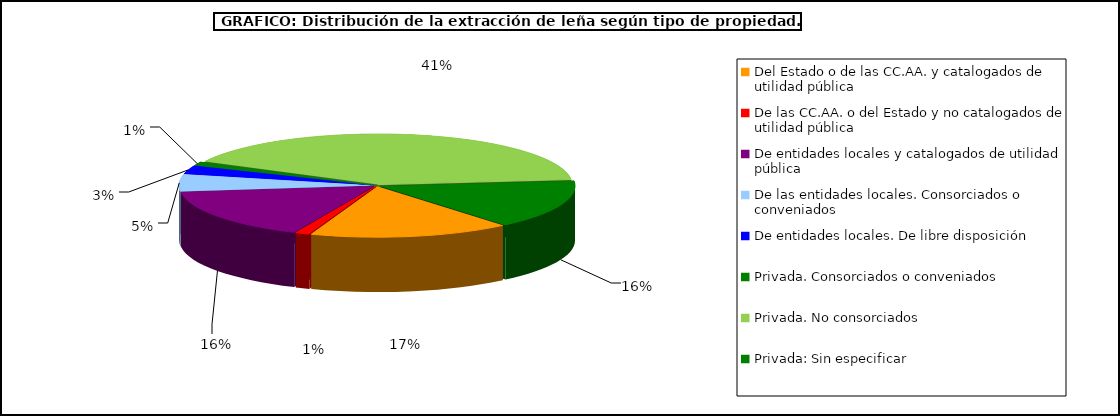
| Category | Series 0 |
|---|---|
| Del Estado o de las CC.AA. y catalogados de utilidad pública | 285976.557 |
| De las CC.AA. o del Estado y no catalogados de utilidad pública | 20364.729 |
| De entidades locales y catalogados de utilidad pública | 280786.675 |
| De las entidades locales. Consorciados o conveniados | 93882.029 |
| De entidades locales. De libre disposición | 47628.738 |
| Privada. Consorciados o conveniados | 20343.27 |
| Privada. No consorciados | 701081.683 |
| Privada: Sin especificar | 266273.59 |